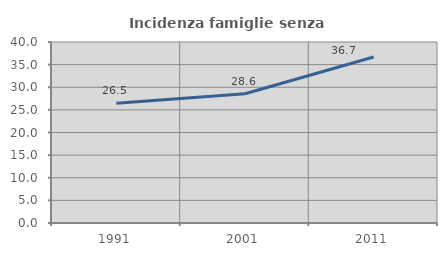
| Category | Incidenza famiglie senza nuclei |
|---|---|
| 1991.0 | 26.457 |
| 2001.0 | 28.571 |
| 2011.0 | 36.674 |